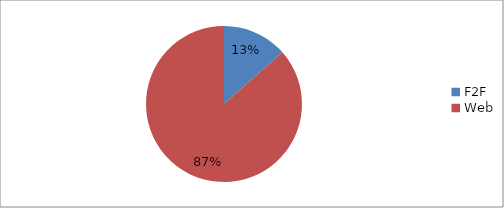
| Category | Series 0 |
|---|---|
| F2F | 33 |
| Web | 212 |